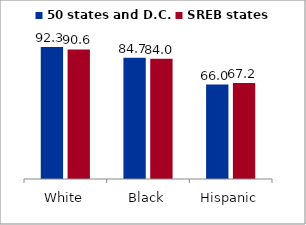
| Category | 50 states and D.C. | SREB states |
|---|---|---|
| White | 92.262 | 90.56 |
| Black | 84.734 | 84.014 |
| Hispanic | 65.997 | 67.184 |